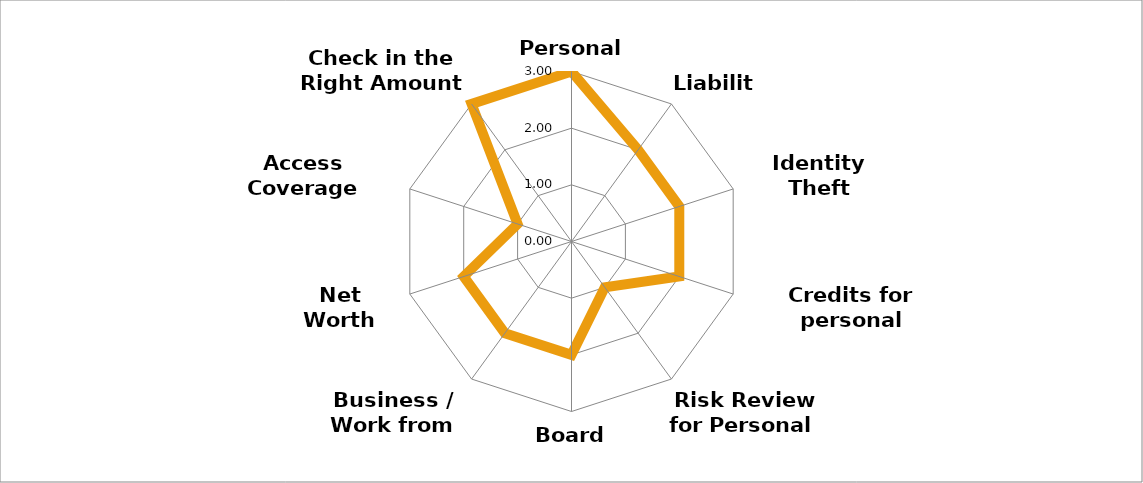
| Category | Series 0 |
|---|---|
| Personal Insurance     | 3 |
| Liability | 2 |
| Identity Theft Protection | 2 |
| Credits for personal coverage | 2 |
| Risk Review for Personal  | 1 |
| Board Member | 2 |
| Business / Work from Home | 2 |
| Net Worth Protection | 2 |
| Access Coverage (umbrella) | 1 |
| Check in the Right Amount | 3 |